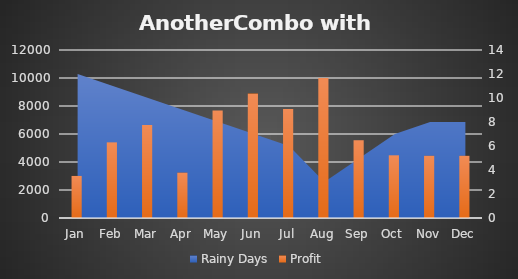
| Category | Profit |
|---|---|
| Jan | 3005 |
| Feb | 5403 |
| Mar | 6644 |
| Apr | 3242 |
| May | 7684 |
| Jun | 8888 |
| Jul | 7777 |
| Aug | 9999 |
| Sep | 5555 |
| Oct | 4478 |
| Nov | 4444 |
| Dec | 4444 |